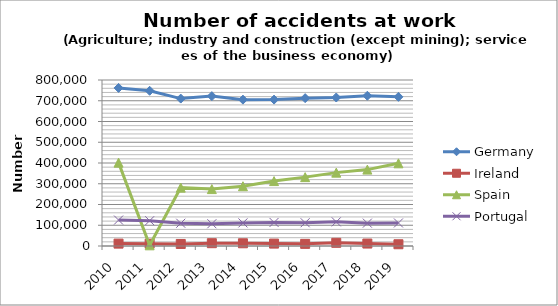
| Category | Germany  | Ireland | Spain | Portugal |
|---|---|---|---|---|
| 2010 | 761816 | 11462 | 401700 | 124935 |
| 2011 | 748029 | 11148 | 3238 | 121910 |
| 2012 | 710413 | 9836 | 281318 | 109673 |
| 2013 | 722288 | 13480 | 274215 | 107231 |
| 2014 | 705290 | 13148 | 288056 | 111282 |
| 2015 | 705499 | 11561 | 312852 | 113540 |
| 2016 | 712567 | 10269 | 331883 | 112066 |
| 2017 | 715599 | 15353 | 353601 | 116281 |
| 2018 | 724073 | 11798 | 368190 | 110184 |
| 2019 | 718782 | 8420 | 398430 | 111046 |